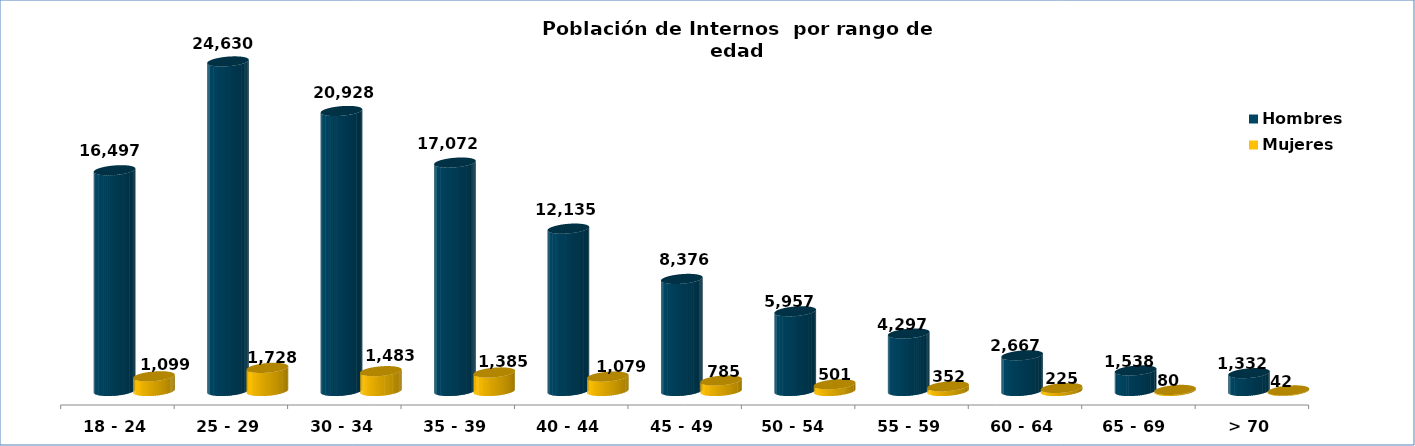
| Category | Hombres | Mujeres |
|---|---|---|
| 18 - 24 | 16497 | 1099 |
| 25 - 29 | 24630 | 1728 |
| 30 - 34 | 20928 | 1483 |
| 35 - 39 | 17072 | 1385 |
| 40 - 44 | 12135 | 1079 |
| 45 - 49 | 8376 | 785 |
| 50 - 54  | 5957 | 501 |
| 55 - 59 | 4297 | 352 |
| 60 - 64 | 2667 | 225 |
| 65 - 69  | 1538 | 80 |
| > 70 | 1332 | 42 |